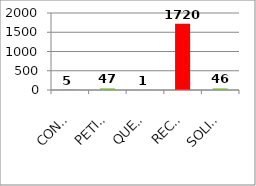
| Category | Series 0 |
|---|---|
| CONSULTA | 5 |
| PETICIÒN INFORMATIVA | 47 |
| QUEJA | 1 |
| RECLAMO | 1720 |
| SOLICITUD | 46 |